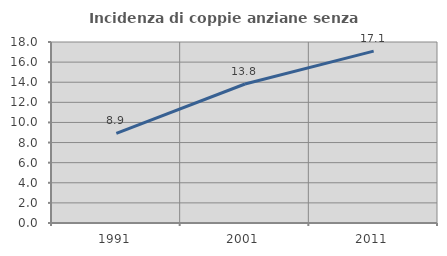
| Category | Incidenza di coppie anziane senza figli  |
|---|---|
| 1991.0 | 8.92 |
| 2001.0 | 13.823 |
| 2011.0 | 17.093 |